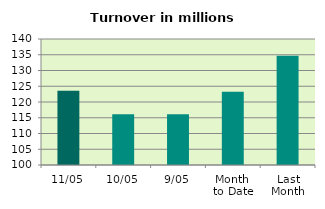
| Category | Series 0 |
|---|---|
| 11/05 | 123.566 |
| 10/05 | 116.145 |
| 9/05 | 116.149 |
| Month 
to Date | 123.27 |
| Last
Month | 134.694 |